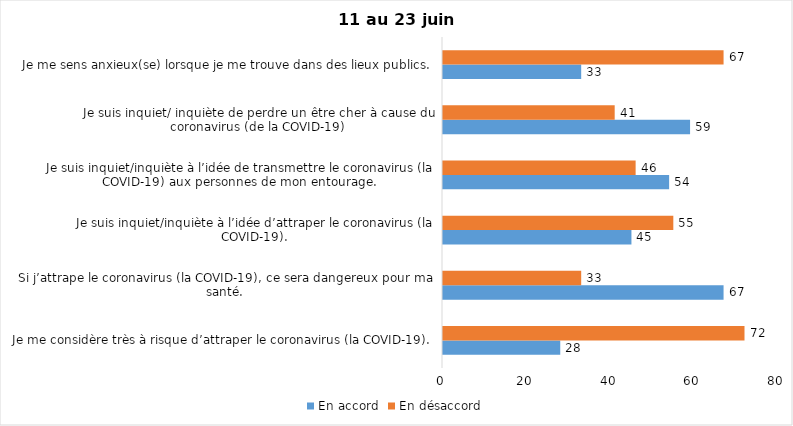
| Category | En accord | En désaccord |
|---|---|---|
| Je me considère très à risque d’attraper le coronavirus (la COVID-19). | 28 | 72 |
| Si j’attrape le coronavirus (la COVID-19), ce sera dangereux pour ma santé. | 67 | 33 |
| Je suis inquiet/inquiète à l’idée d’attraper le coronavirus (la COVID-19). | 45 | 55 |
| Je suis inquiet/inquiète à l’idée de transmettre le coronavirus (la COVID-19) aux personnes de mon entourage. | 54 | 46 |
| Je suis inquiet/ inquiète de perdre un être cher à cause du coronavirus (de la COVID-19) | 59 | 41 |
| Je me sens anxieux(se) lorsque je me trouve dans des lieux publics. | 33 | 67 |